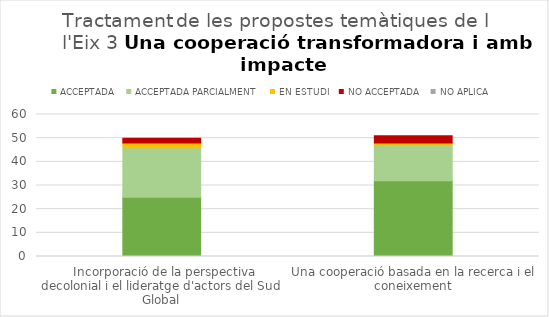
| Category | ACCEPTADA | ACCEPTADA PARCIALMENT | EN ESTUDI | NO ACCEPTADA | NO APLICA |
|---|---|---|---|---|---|
|  Incorporació de la perspectiva decolonial i el lideratge d'actors del Sud Global | 25 | 21 | 2 | 2 | 0 |
| Una cooperació basada en la recerca i el coneixement | 32 | 15 | 1 | 3 | 0 |